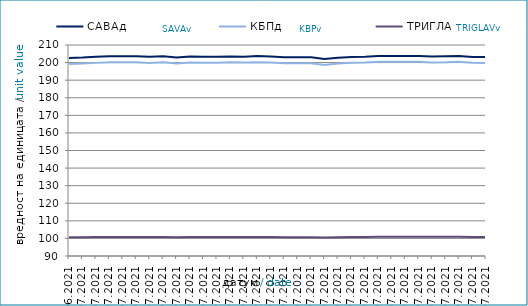
| Category | САВАд | КБПд | ТРИГЛАВд |
|---|---|---|---|
| 2021-06-30 | 202.616 | 199.187 | 100.674 |
| 2021-07-01 | 202.843 | 199.443 | 100.733 |
| 2021-07-02 | 203.329 | 199.833 | 100.782 |
| 2021-07-03 | 203.572 | 200.14 | 100.833 |
| 2021-07-04 | 203.577 | 200.147 | 100.838 |
| 2021-07-05 | 203.586 | 200.248 | 100.843 |
| 2021-07-06 | 203.254 | 199.767 | 100.764 |
| 2021-07-07 | 203.618 | 200.132 | 100.814 |
| 2021-07-08 | 202.963 | 199.419 | 100.699 |
| 2021-07-09 | 203.449 | 200.032 | 100.774 |
| 2021-07-10 | 203.352 | 199.911 | 100.752 |
| 2021-07-11 | 203.357 | 199.918 | 100.756 |
| 2021-07-12 | 203.518 | 200.133 | 100.793 |
| 2021-07-13 | 203.382 | 199.983 | 100.741 |
| 2021-07-14 | 203.713 | 200.178 | 100.75 |
| 2021-07-15 | 203.484 | 200.038 | 100.747 |
| 2021-07-16 | 202.995 | 199.6 | 100.676 |
| 2021-07-17 | 202.991 | 199.608 | 100.672 |
| 2021-07-18 | 202.997 | 199.615 | 100.694 |
| 2021-07-19 | 202.028 | 198.667 | 100.574 |
| 2021-07-20 | 202.744 | 199.437 | 100.723 |
| 2021-07-21 | 203.153 | 199.87 | 100.8 |
| 2021-07-22 | 203.272 | 200.049 | 100.799 |
| 2021-07-23 | 203.726 | 200.495 | 100.954 |
| 2021-07-24 | 203.754 | 200.535 | 100.964 |
| 2021-07-25 | 203.76 | 200.542 | 100.967 |
| 2021-07-26 | 203.762 | 200.522 | 100.987 |
| 2021-07-27 | 203.395 | 200.075 | 100.891 |
| 2021-07-28 | 203.554 | 200.163 | 100.899 |
| 2021-07-29 | 203.764 | 200.49 | 100.994 |
| 2021-07-30 | 203.159 | 199.894 | 100.835 |
| 2021-07-31 | 203.109 | 199.825 | 100.823 |